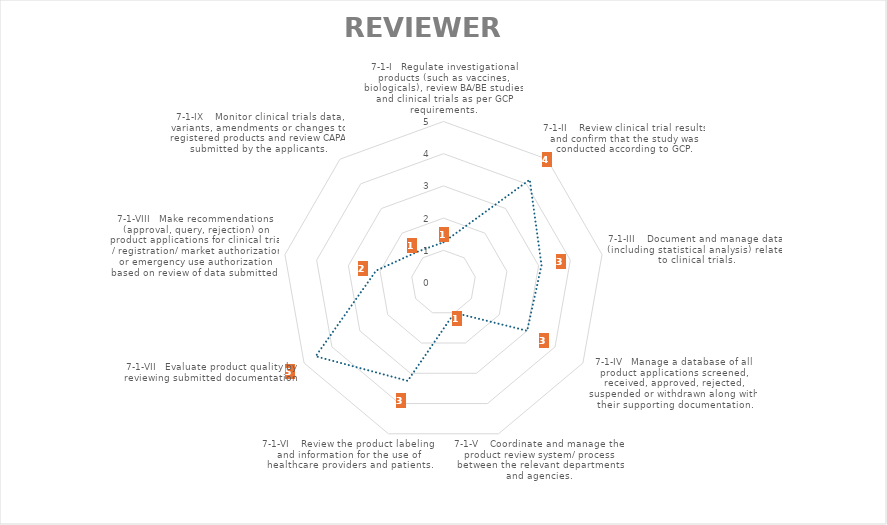
| Category | Average |
|---|---|
| 7-1-I   Regulate investigational products (such as vaccines, biologicals), review BA/BE studies and clinical trials as per GCP requirements. | 1.25 |
| 7-1-II    Review clinical trial results and confirm that the study was conducted according to GCP. | 4.167 |
| 7-1-III    Document and manage data (including statistical analysis) related to clinical trials. | 3.091 |
| 7-1-IV   Manage a database of all product applications screened, received, approved, rejected, suspended or withdrawn along with their supporting documentation. | 3 |
| 7-1-V    Coordinate and manage the product review system/ process between the relevant departments and agencies. | 1 |
| 7-1-VI    Review the product labeling and information for the use of healthcare providers and patients. | 3.25 |
| 7-1-VII   Evaluate product quality by reviewing submitted documentation. | 4.583 |
| 7-1-VIII   Make recommendations (approval, query, rejection) on product applications for clinical trial / registration/ market authorization or emergency use authorization based on review of data submitted. | 2.125 |
| 7-1-IX    Monitor clinical trials data, variants, amendments or changes to registered products and review CAPA submitted by the applicants. | 1.25 |